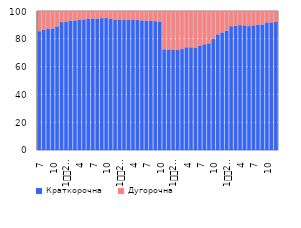
| Category | Краткорочна | Дугорочна |
|---|---|---|
| 7 | 85.44 | 14.56 |
| 8 | 86.467 | 13.533 |
| 9 | 87.282 | 12.718 |
| 10 | 87.377 | 12.623 |
| 11 | 88.789 | 11.211 |
| 12 | 92 | 8 |
| 1
2009. | 92.392 | 7.608 |
| 2 | 93.019 | 6.981 |
| 3 | 93.095 | 6.905 |
| 4 | 93.444 | 6.556 |
| 5 | 93.851 | 6.149 |
| 6 | 94.233 | 5.767 |
| 7 | 94.364 | 5.636 |
| 8 | 94.406 | 5.594 |
| 9 | 94.872 | 5.128 |
| 10 | 94.872 | 5.128 |
| 11 | 94.284 | 5.716 |
| 12 | 93.653 | 6.347 |
| 1
2010. | 93.743 | 6.257 |
| 2 | 93.78 | 6.22 |
| 3 | 93.471 | 6.529 |
| 4 | 93.509 | 6.491 |
| 5 | 93.447 | 6.553 |
| 6 | 93.232 | 6.768 |
| 7 | 92.987 | 7.013 |
| 8 | 92.86 | 7.14 |
| 9 | 92.663 | 7.337 |
| 10 | 92.447 | 7.553 |
| 11 | 72.411 | 27.589 |
| 12 | 72.29 | 27.71 |
| 1
2011. | 72.103 | 27.897 |
| 2 | 72.162 | 27.838 |
| 3 | 72.606 | 27.394 |
| 4 | 73.825 | 26.175 |
| 5 | 73.812 | 26.188 |
| 6 | 73.583 | 26.417 |
| 7 | 74.981 | 25.019 |
| 8 | 76.028 | 23.972 |
| 9 | 76.633 | 23.367 |
| 10 | 79.825 | 20.175 |
| 11 | 83.163 | 16.837 |
| 12 | 84.479 | 15.521 |
| 1
2012. | 85.78 | 14.22 |
| 2 | 89.025 | 10.975 |
| 3 | 89.187 | 10.813 |
| 4 | 89.787 | 10.213 |
| 5 | 89.594 | 10.406 |
| 6 | 89.092 | 10.908 |
| 7 | 89.59 | 10.41 |
| 8 | 90.008 | 9.992 |
| 9 | 90.211 | 9.789 |
| 10 | 91.695 | 8.305 |
| 11 | 91.745 | 8.255 |
| 12 | 92.207 | 7.793 |